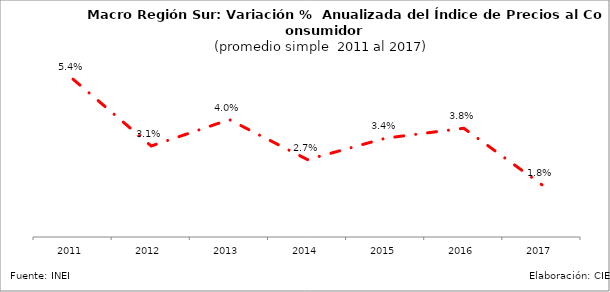
| Category | Series 0 |
|---|---|
| 2011.0 | 0.054 |
| 2012.0 | 0.031 |
| 2013.0 | 0.04 |
| 2014.0 | 0.027 |
| 2015.0 | 0.034 |
| 2016.0 | 0.038 |
| 2017.0 | 0.018 |